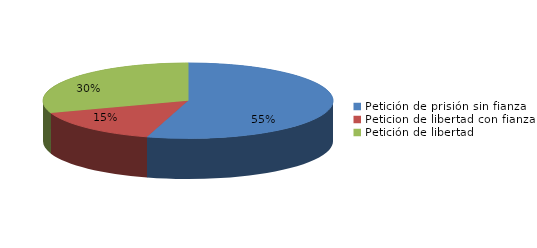
| Category | Series 0 |
|---|---|
| Petición de prisión sin fianza | 18 |
| Peticion de libertad con fianza | 5 |
| Petición de libertad | 10 |